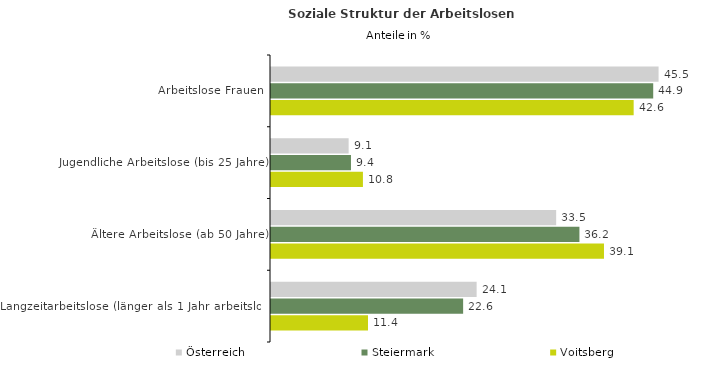
| Category | Österreich | Steiermark | Voitsberg |
|---|---|---|---|
| Arbeitslose Frauen | 45.49 | 44.861 | 42.566 |
| Jugendliche Arbeitslose (bis 25 Jahre) | 9.111 | 9.387 | 10.79 |
| Ältere Arbeitslose (ab 50 Jahre) | 33.469 | 36.201 | 39.082 |
| Langzeitarbeitslose (länger als 1 Jahr arbeitslos) | 24.136 | 22.55 | 11.385 |